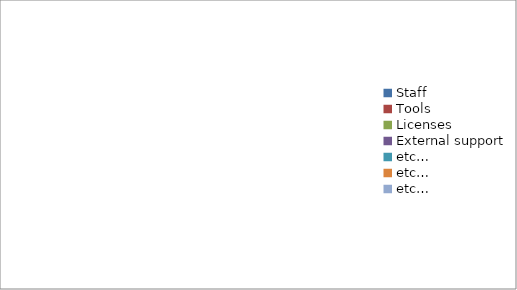
| Category | Series 0 |
|---|---|
| Staff | 0 |
| Tools | 0 |
| Licenses | 0 |
| External support | 0 |
| etc… | 0 |
| etc… | 0 |
| etc… | 0 |